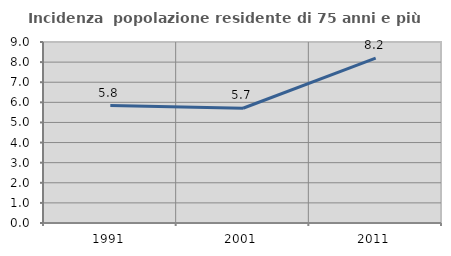
| Category | Incidenza  popolazione residente di 75 anni e più |
|---|---|
| 1991.0 | 5.84 |
| 2001.0 | 5.705 |
| 2011.0 | 8.202 |